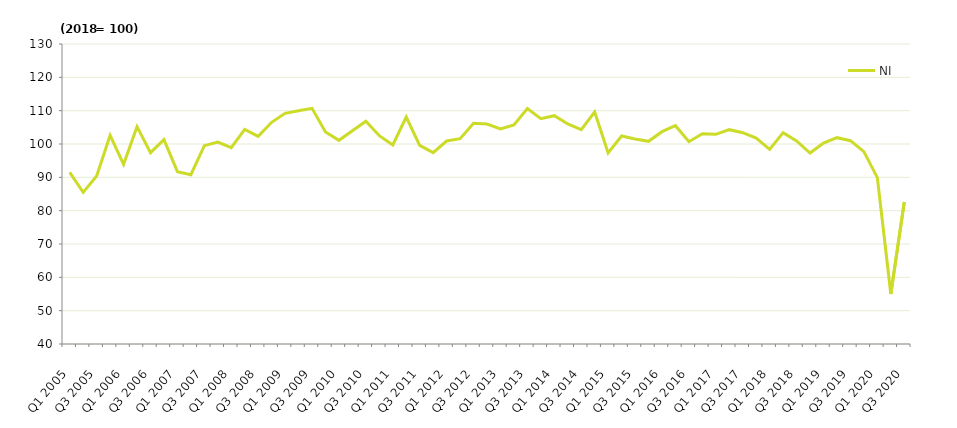
| Category | NI |
|---|---|
| Q1 2005 | 91.5 |
|  | 85.5 |
| Q3 2005 | 90.4 |
|  | 102.6 |
| Q1 2006 | 93.9 |
|  | 105.2 |
| Q3 2006 | 97.4 |
|  | 101.3 |
| Q1 2007 | 91.7 |
|  | 90.8 |
| Q3 2007 | 99.5 |
|  | 100.6 |
| Q1 2008 | 98.9 |
|  | 104.4 |
| Q3 2008 | 102.3 |
|  | 106.5 |
| Q1 2009 | 109.2 |
|  | 110 |
| Q3 2009 | 110.7 |
|  | 103.6 |
| Q1 2010 | 101.1 |
|  | 104 |
| Q3 2010 | 106.8 |
|  | 102.5 |
| Q1 2011 | 99.7 |
|  | 108.1 |
| Q3 2011 | 99.6 |
|  | 97.4 |
| Q1 2012 | 100.9 |
|  | 101.6 |
| Q3 2012 | 106.2 |
|  | 106 |
| Q1 2013 | 104.5 |
|  | 105.7 |
| Q3 2013 | 110.6 |
|  | 107.6 |
| Q1 2014 | 108.5 |
|  | 106 |
| Q3 2014 | 104.3 |
|  | 109.6 |
| Q1 2015 | 97.3 |
|  | 102.4 |
| Q3 2015 | 101.5 |
|  | 100.8 |
| Q1 2016 | 103.7 |
|  | 105.5 |
| Q3 2016 | 100.7 |
|  | 103.1 |
| Q1 2017 | 102.9 |
|  | 104.3 |
| Q3 2017 | 103.4 |
|  | 101.8 |
| Q1 2018 | 98.4 |
|  | 103.4 |
| Q3 2018 | 100.9 |
|  | 97.3 |
| Q1 2019 | 100.3 |
|  | 101.9 |
| Q3 2019 | 101 |
|  | 97.7 |
| Q1 2020 | 89.9 |
|  | 55 |
| Q3 2020 | 82.6 |